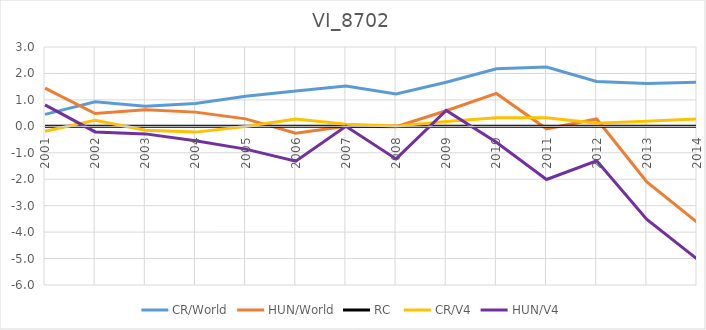
| Category | CR/World | HUN/World | RC  | CR/V4 | HUN/V4 |
|---|---|---|---|---|---|
| 2001.0 | 0.452 | 1.446 | 0 | -0.183 | 0.811 |
| 2002.0 | 0.929 | 0.486 | 0 | 0.231 | -0.211 |
| 2003.0 | 0.762 | 0.627 | 0 | -0.151 | -0.286 |
| 2004.0 | 0.861 | 0.537 | 0 | -0.219 | -0.543 |
| 2005.0 | 1.136 | 0.282 | 0 | -0.008 | -0.861 |
| 2006.0 | 1.339 | -0.257 | 0 | 0.277 | -1.32 |
| 2007.0 | 1.522 | 0 | 0 | 0.077 | 0 |
| 2008.0 | 1.223 | -0.016 | 0 | 0.008 | -1.231 |
| 2009.0 | 1.665 | 0.589 | 0 | 0.181 | 0.599 |
| 2010.0 | 2.173 | 1.244 | 0 | 0.328 | -0.601 |
| 2011.0 | 2.239 | -0.094 | 0 | 0.322 | -2.011 |
| 2012.0 | 1.698 | 0.278 | 0 | 0.115 | -1.306 |
| 2013.0 | 1.618 | -2.1 | 0 | 0.195 | -3.523 |
| 2014.0 | 1.67 | -3.624 | 0 | 0.28 | -5.014 |